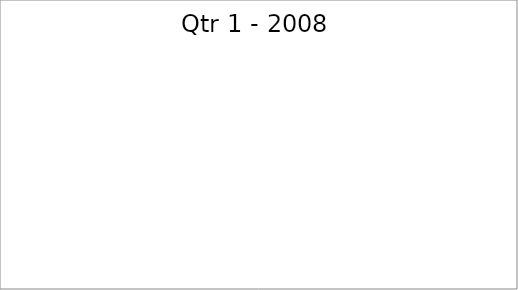
| Category | Series 0 |
|---|---|
| Budget | 3440 |
| Projected | 1320 |
| Actual | 2080 |
| Forecast | 1420 |